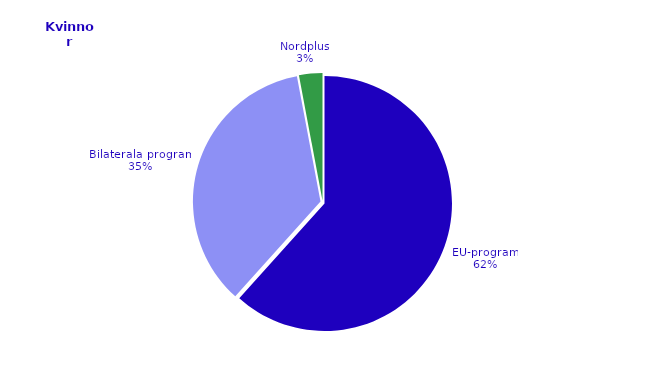
| Category | Series 0 |
|---|---|
| EU-program | 4535 |
| Bilaterala program | 2603 |
| Nordplus | 218 |